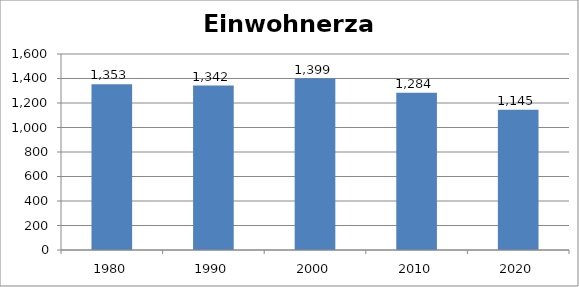
| Category | Einwohnerzahl |
|---|---|
| 1980.0 | 1353 |
| 1990.0 | 1342 |
| 2000.0 | 1399 |
| 2010.0 | 1284 |
| 2020.0 | 1145 |